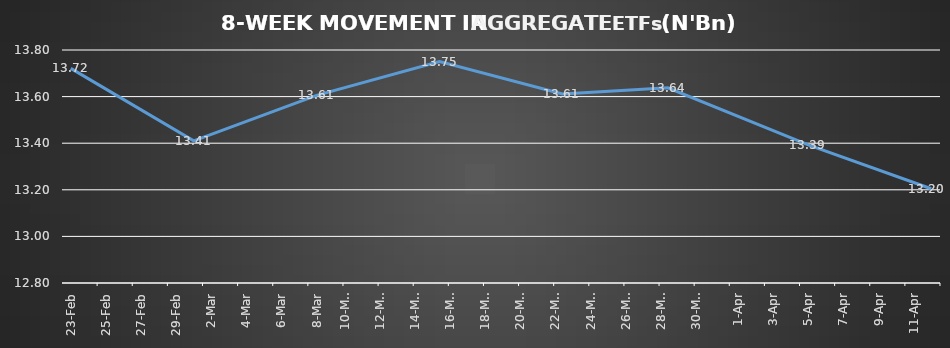
| Category | ETFs AGGREGATE |
|---|---|
| 2024-02-23 | 13.721 |
| 2024-03-01 | 13.41 |
| 2024-03-08 | 13.605 |
| 2024-03-15 | 13.75 |
| 2024-03-22 | 13.612 |
| 2024-03-28 | 13.638 |
| 2024-04-05 | 13.392 |
| 2024-04-12 | 13.205 |